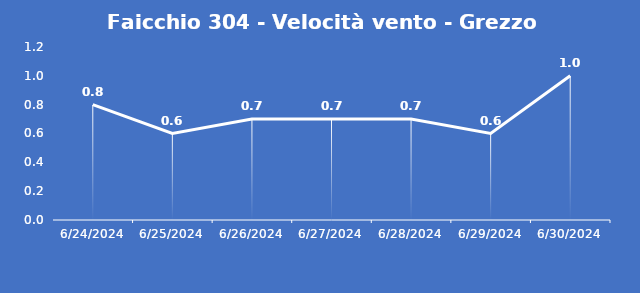
| Category | Faicchio 304 - Velocità vento - Grezzo (m/s) |
|---|---|
| 6/24/24 | 0.8 |
| 6/25/24 | 0.6 |
| 6/26/24 | 0.7 |
| 6/27/24 | 0.7 |
| 6/28/24 | 0.7 |
| 6/29/24 | 0.6 |
| 6/30/24 | 1 |